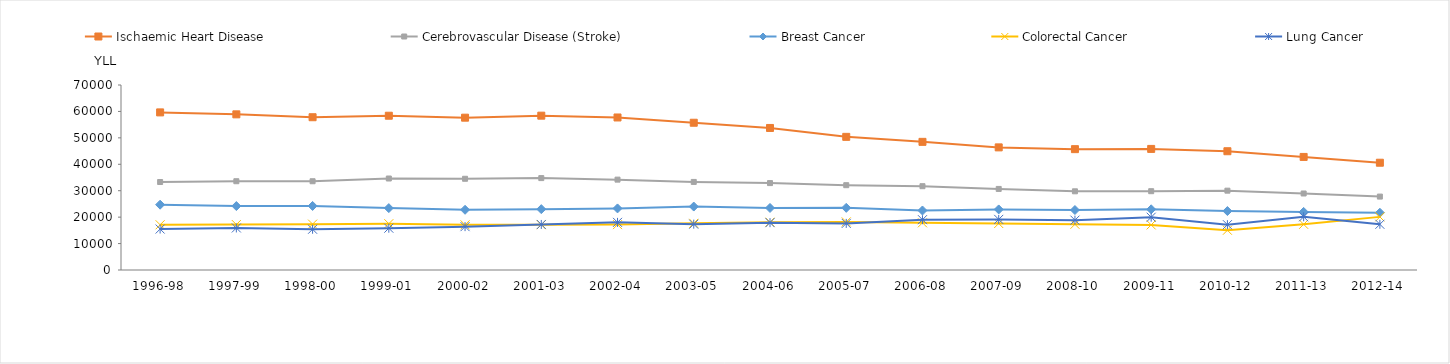
| Category | Ischaemic Heart Disease | Cerebrovascular Disease (Stroke) | Breast Cancer | Colorectal Cancer | Lung Cancer |
|---|---|---|---|---|---|
| 1996-98 | 59635.71 | 33292.85 | 24718.11 | 17112.18 | 15501.58 |
| 1997-99 | 58894.04 | 33592.34 | 24189.8 | 17186.06 | 15903.91 |
| 1998-00 | 57803.45 | 33586.82 | 24245.19 | 17356.62 | 15415.06 |
| 1999-01 | 58376.55 | 34617.17 | 23423.03 | 17512.6 | 15820.41 |
| 2000-02 | 57634.71 | 34517.77 | 22784.19 | 17084.77 | 16407.4 |
| 2001-03 | 58395.4 | 34771.56 | 23022.03 | 17132.89 | 17232.91 |
| 2002-04 | 57713.39 | 34195.02 | 23293.95 | 17178.35 | 18020.74 |
| 2003-05 | 55718.58 | 33326.13 | 24005.9 | 17658.61 | 17342.81 |
| 2004-06 | 53746.83 | 32887.88 | 23473.42 | 18094.11 | 17916.13 |
| 2005-07 | 50378.39 | 32087.97 | 23521.14 | 18192.21 | 17628.23 |
| 2006-08 | 48486.12 | 31709.64 | 22513.95 | 17858.07 | 19039.93 |
| 2007-09 | 46395.71 | 30677.62 | 22919.35 | 17599.23 | 19154.36 |
| 2008-10 | 45725.65 | 29773.7 | 22693.73 | 17296.13 | 18864.21 |
| 2009-11 | 45813.63 | 29819.71 | 22962.31 | 17063.65 | 19973.38 |
| 2010-12 | 44940.02 | 30021.74 | 22303.68 | 15044.87 | 17146.72 |
| 2011-13 | 42783.44 | 28946.96 | 21984.34 | 17292.76 | 20121.2 |
| 2012-14 | 40590.28 | 27779.2 | 21660.45 | 20102.8 | 17296.74 |